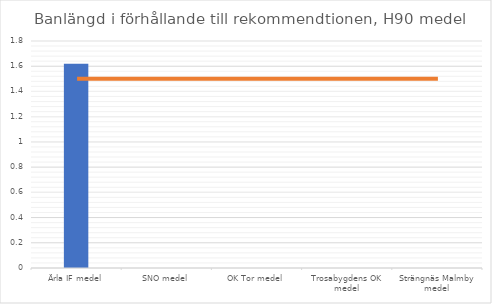
| Category | H90 längd |
|---|---|
| Ärla IF medel | 1.62 |
| SNO medel | 0 |
| OK Tor medel | 0 |
| Trosabygdens OK medel | 0 |
| Strängnäs Malmby medel | 0 |